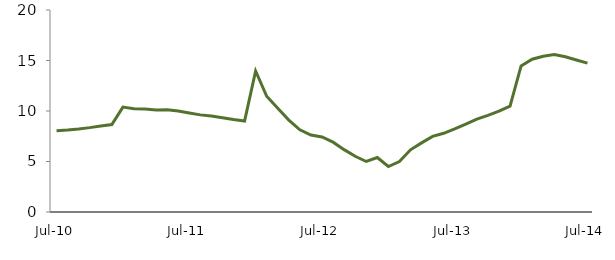
| Category | Series 0 |
|---|---|
| Jul-10 | 8.053 |
|  | 8.123 |
|  | 8.226 |
|  | 8.355 |
|  | 8.51 |
|  | 8.658 |
|  | 10.387 |
|  | 10.226 |
|  | 10.187 |
|  | 10.098 |
|  | 10.112 |
|  | 9.997 |
| Jul-11 | 9.799 |
|  | 9.617 |
|  | 9.496 |
|  | 9.328 |
|  | 9.151 |
|  | 9.003 |
|  | 13.958 |
|  | 11.462 |
|  | 10.275 |
|  | 9.102 |
|  | 8.135 |
|  | 7.62 |
| Jul-12 | 7.427 |
|  | 6.915 |
|  | 6.173 |
|  | 5.517 |
|  | 5.001 |
|  | 5.391 |
|  | 4.502 |
|  | 4.988 |
|  | 6.155 |
|  | 6.846 |
|  | 7.49 |
|  | 7.793 |
| Jul-13 | 8.223 |
|  | 8.703 |
|  | 9.197 |
|  | 9.564 |
|  | 9.978 |
|  | 10.478 |
|  | 14.467 |
|  | 15.129 |
|  | 15.422 |
|  | 15.593 |
|  | 15.372 |
|  | 15.054 |
| Jul-14 | 14.745 |